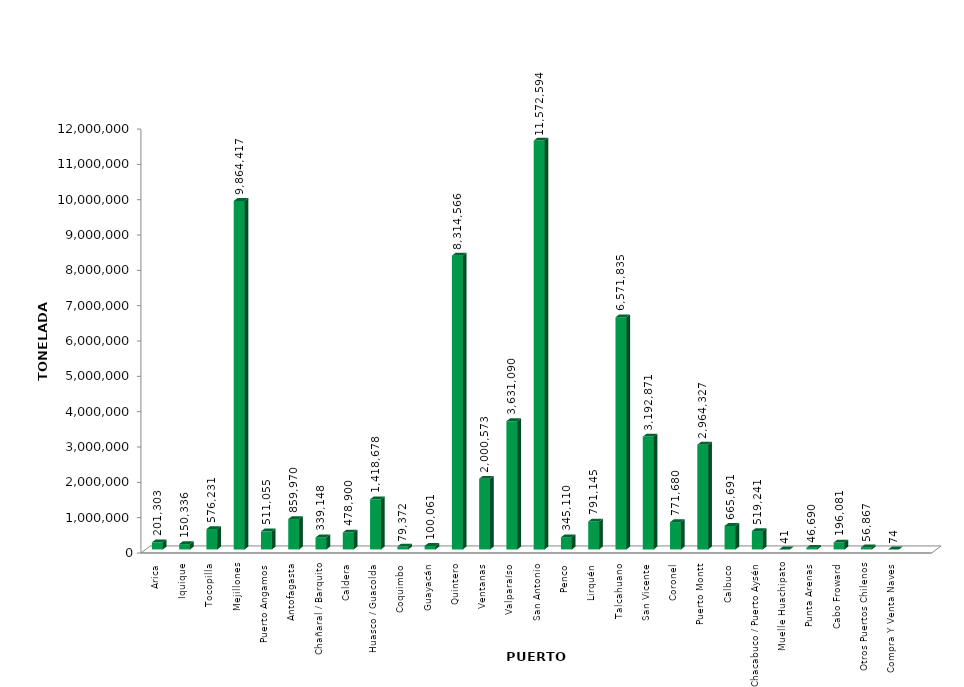
| Category | Series 0 |
|---|---|
| Arica | 201302.654 |
| Iquique | 150336.224 |
| Tocopilla | 576231.296 |
| Mejillones | 9864416.69 |
| Puerto Angamos | 511055.22 |
| Antofagasta | 859970.45 |
| Chañaral / Barquito | 339147.605 |
| Caldera | 478900.034 |
| Huasco / Guacolda | 1418678.47 |
| Coquimbo | 79372.164 |
| Guayacán | 100060.566 |
| Quintero | 8314566.445 |
| Ventanas | 2000573.249 |
| Valparaíso | 3631089.825 |
| San Antonio | 11572594.24 |
| Penco | 345110.335 |
| Lirquén | 791145.416 |
| Talcahuano | 6571835.177 |
| San Vicente | 3192871.45 |
| Coronel | 771679.541 |
| Puerto Montt | 2964326.776 |
| Calbuco | 665690.817 |
| Chacabuco / Puerto Aysén | 519240.995 |
| Muelle Huachipato | 41.057 |
| Punta Arenas | 46689.999 |
| Cabo Froward | 196081.002 |
| Otros Puertos Chilenos | 56867.133 |
| Compra Y Venta Naves | 74 |